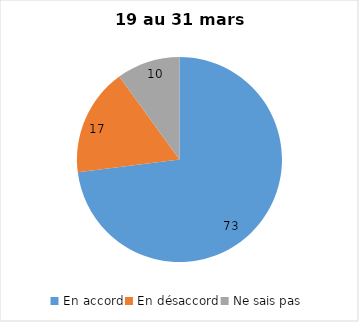
| Category | Series 0 |
|---|---|
| En accord | 73 |
| En désaccord | 17 |
| Ne sais pas | 10 |